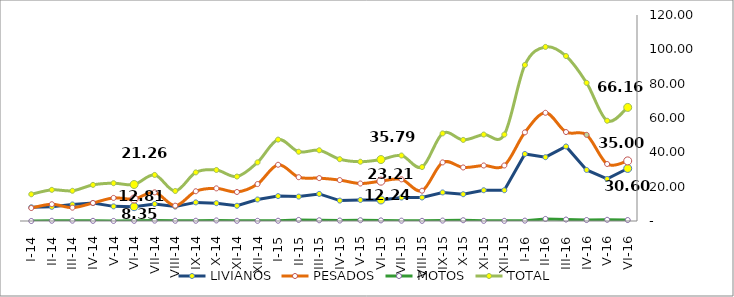
| Category | LIVIANOS | PESADOS | MOTOS | TOTAL |
|---|---|---|---|---|
| I-14 | 8.004 | 7.56 | 0 | 15.564 |
| II-14 | 8.236 | 9.765 | 0.15 | 18.151 |
| III-14 | 9.628 | 7.77 | 0.2 | 17.598 |
| IV-14 | 10.44 | 10.5 | 0.1 | 21.04 |
| V-14 | 8.526 | 13.44 | 0.05 | 22.016 |
| VI-14 | 8.352 | 12.81 | 0.1 | 21.262 |
| VII-14 | 9.918 | 16.695 | 0.225 | 26.838 |
| VIII-14 | 8.41 | 8.925 | 0.15 | 17.485 |
| IX-14 | 10.846 | 17.325 | 0.15 | 28.321 |
| X-14 | 10.382 | 19.005 | 0.325 | 29.712 |
| XI-14 | 8.874 | 16.905 | 0.125 | 25.904 |
| XII-14 | 12.528 | 21.525 | 0.1 | 34.153 |
| I-15 | 14.5 | 32.76 | 0.15 | 47.41 |
| II-15 | 14.21 | 25.515 | 0.625 | 40.35 |
| III-15 | 15.776 | 24.99 | 0.425 | 41.191 |
| IV-15 | 11.89 | 23.835 | 0.275 | 36 |
| V-15 | 12.238 | 21.84 | 0.45 | 34.528 |
| VI-15 | 12.238 | 23.205 | 0.35 | 35.793 |
| VII-15 | 13.688 | 24.255 | 0.2 | 38.143 |
| VIII-15 | 13.688 | 17.64 | 0.1 | 31.428 |
| IX-15 | 16.646 | 34.125 | 0.25 | 51.021 |
| X-15 | 15.602 | 31.185 | 0.45 | 47.237 |
| XI-15 | 17.922 | 32.34 | 0.1 | 50.362 |
| XII-15 | 17.922 | 32.34 | 0.1 | 50.362 |
| I-16 | 39.058 | 51.612 | 0.211 | 90.881 |
| II-16 | 37.17 | 63.036 | 1.196 | 101.402 |
| III-16 | 43.424 | 51.816 | 0.844 | 96.084 |
| IV-16 | 29.736 | 50.184 | 0.563 | 80.483 |
| V-16 | 24.5 | 33.2 | 0.7 | 58.4 |
| VI-16 | 30.6 | 35 | 0.56 | 66.16 |